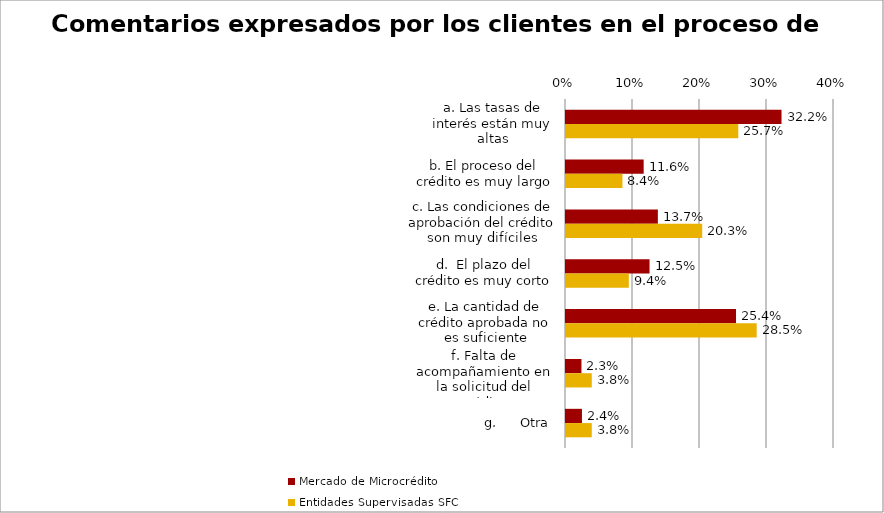
| Category | Mercado de Microcrédito | Entidades Supervisadas SFC |
|---|---|---|
| a. Las tasas de interés están muy altas | 0.322 | 0.257 |
| b. El proceso del crédito es muy largo | 0.116 | 0.084 |
| c. Las condiciones de aprobación del crédito son muy difíciles | 0.137 | 0.203 |
| d.  El plazo del crédito es muy corto | 0.125 | 0.094 |
| e. La cantidad de crédito aprobada no es suficiente | 0.254 | 0.285 |
| f. Falta de acompañamiento en la solicitud del crédito | 0.023 | 0.038 |
| g.      Otra | 0.024 | 0.038 |